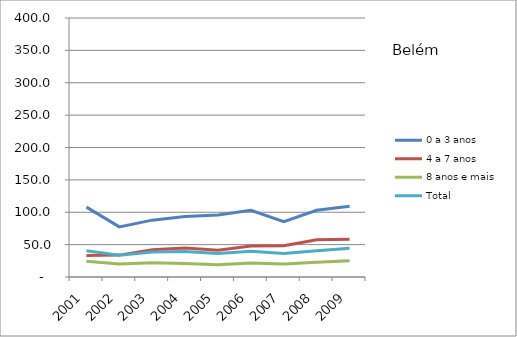
| Category | 0 a 3 anos | 4 a 7 anos | 8 anos e mais | Total |
|---|---|---|---|---|
| 2001.0 | 107.9 | 33.2 | 24.3 | 40.4 |
| 2002.0 | 77.4 | 33.8 | 19.9 | 33.5 |
| 2003.0 | 87.8 | 42 | 22 | 38.5 |
| 2004.0 | 93.5 | 44.8 | 20.7 | 39.4 |
| 2005.0 | 95.8 | 41.5 | 18.8 | 36.2 |
| 2006.0 | 103 | 47.8 | 21.5 | 39.9 |
| 2007.0 | 85.5 | 48.2 | 20.2 | 36.3 |
| 2008.0 | 103 | 57.5 | 22.7 | 40.7 |
| 2009.0 | 109.4 | 58.2 | 25.2 | 44.3 |